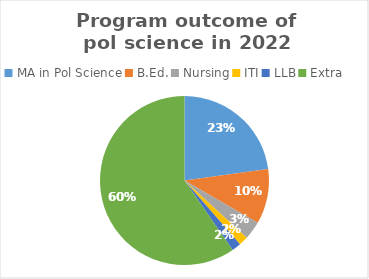
| Category | Series 0 |
|---|---|
| MA in Pol Science | 13 |
| B.Ed. | 6 |
| Nursing | 2 |
| ITI | 1 |
| LLB | 1 |
| Extra | 34 |